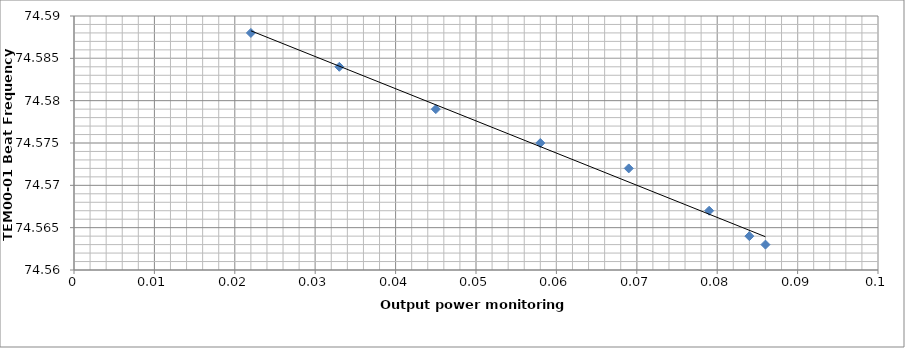
| Category | Series 0 |
|---|---|
| 0.086 | 74.563 |
| 0.084 | 74.564 |
| 0.079 | 74.567 |
| 0.069 | 74.572 |
| 0.058 | 74.575 |
| 0.045 | 74.579 |
| 0.033 | 74.584 |
| 0.022 | 74.588 |